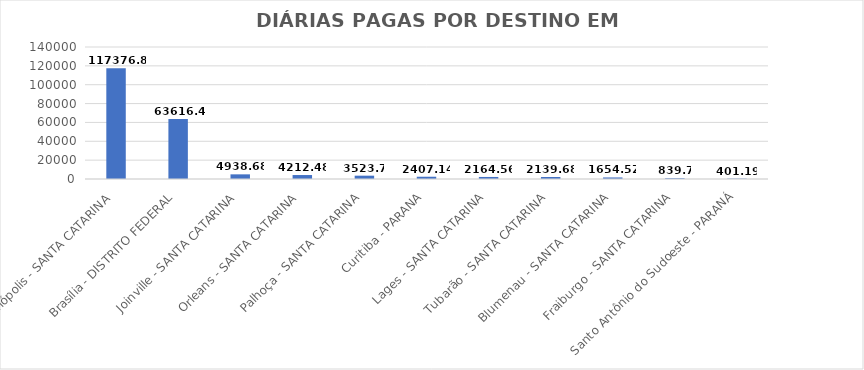
| Category | Total |
|---|---|
| Florianópolis - SANTA CATARINA | 117376.83 |
| Brasília - DISTRITO FEDERAL | 63616.46 |
| Joinville - SANTA CATARINA | 4938.68 |
| Orleans - SANTA CATARINA | 4212.48 |
| Palhoça - SANTA CATARINA | 3523.7 |
| Curitiba - PARANA | 2407.14 |
| Lages - SANTA CATARINA | 2164.56 |
| Tubarão - SANTA CATARINA | 2139.68 |
| Blumenau - SANTA CATARINA | 1654.52 |
| Fraiburgo - SANTA CATARINA | 839.7 |
| Santo Antônio do Sudoeste - PARANÁ | 401.19 |